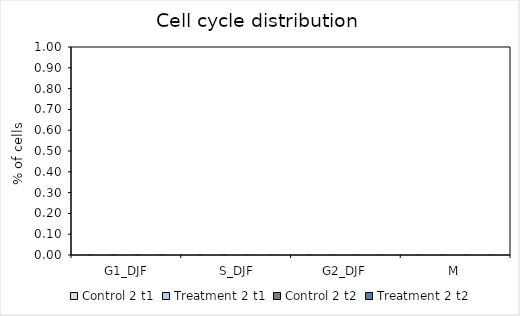
| Category | Control 2 | Treatment 2 |
|---|---|---|
|  G1_DJF | 0 | 0 |
|  S_DJF | 0 | 0 |
| G2_DJF | 0 | 0 |
| M | 0 | 0 |